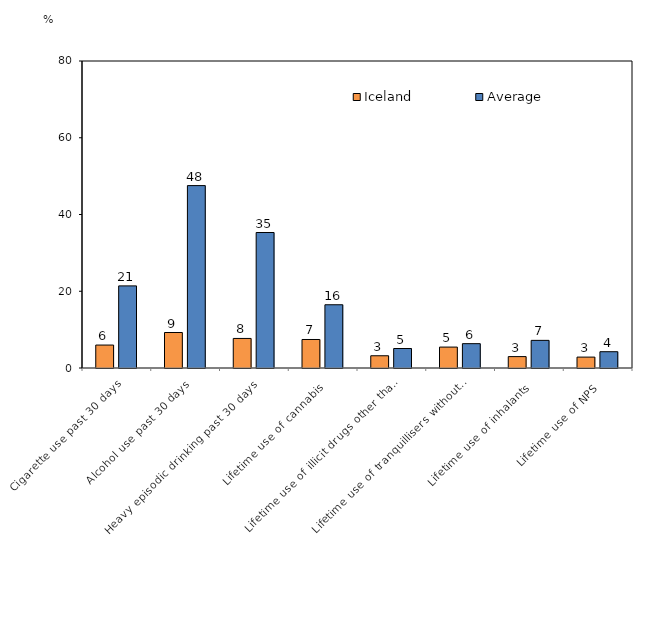
| Category | Iceland | Average |
|---|---|---|
| Cigarette use past 30 days | 5.98 | 21.397 |
| Alcohol use past 30 days | 9.25 | 47.531 |
| Heavy episodic drinking past 30 days | 7.7 | 35.309 |
| Lifetime use of cannabis | 7.43 | 16.48 |
| Lifetime use of illicit drugs other than cannabis | 3.19 | 5.079 |
| Lifetime use of tranquillisers without prescription  | 5.45 | 6.34 |
| Lifetime use of inhalants | 2.97 | 7.202 |
| Lifetime use of NPS | 2.84 | 4.246 |